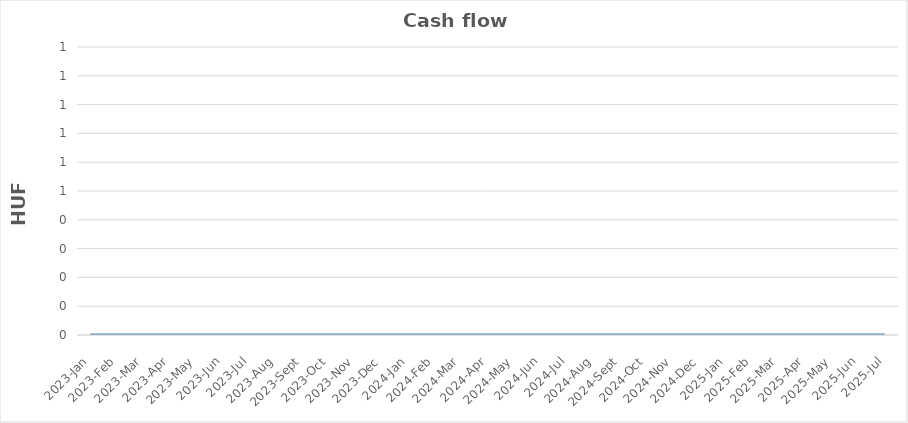
| Category | Cash flow |
|---|---|
| 2023-01-15 | 0 |
| 2023-02-15 | 0 |
| 2023-03-15 | 0 |
| 2023-04-15 | 0 |
| 2023-05-15 | 0 |
| 2023-06-15 | 0 |
| 2023-07-15 | 0 |
| 2023-08-15 | 0 |
| 2023-09-15 | 0 |
| 2023-10-15 | 0 |
| 2023-11-15 | 0 |
| 2023-12-15 | 0 |
| 2024-01-15 | 0 |
| 2024-02-15 | 0 |
| 2024-03-15 | 0 |
| 2024-04-15 | 0 |
| 2024-05-15 | 0 |
| 2024-06-15 | 0 |
| 2024-07-15 | 0 |
| 2024-08-15 | 0 |
| 2024-09-15 | 0 |
| 2024-10-15 | 0 |
| 2024-11-15 | 0 |
| 2024-12-15 | 0 |
| 2025-01-15 | 0 |
| 2025-02-15 | 0 |
| 2025-03-15 | 0 |
| 2025-04-15 | 0 |
| 2025-05-15 | 0 |
| 2025-06-15 | 0 |
| 2025-07-15 | 0 |